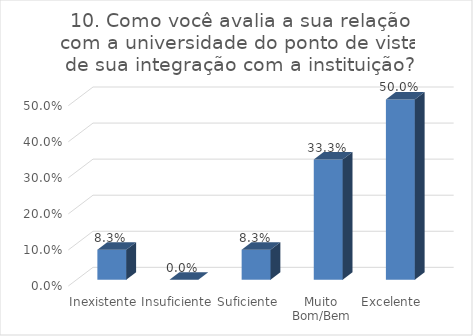
| Category | 10. Como você avalia a sua relação com a universidade do ponto de vista de sua integração com a instituição? |
|---|---|
| Inexistente | 0.083 |
| Insuficiente | 0 |
| Suficiente | 0.083 |
| Muito Bom/Bem | 0.333 |
| Excelente | 0.5 |